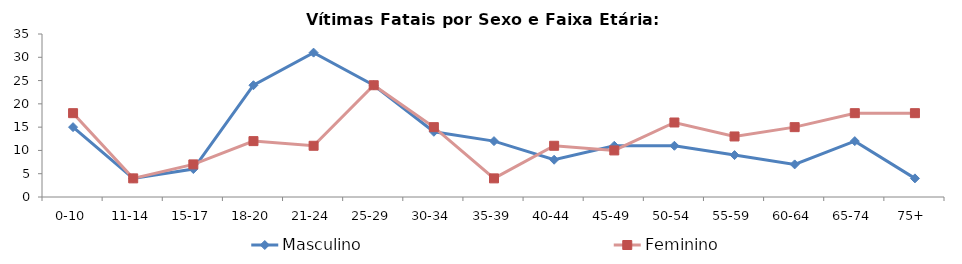
| Category | Masculino | Feminino |
|---|---|---|
| 0-10 | 15 | 18 |
| 11-14 | 4 | 4 |
| 15-17 | 6 | 7 |
| 18-20 | 24 | 12 |
| 21-24 | 31 | 11 |
| 25-29 | 24 | 24 |
| 30-34 | 14 | 15 |
| 35-39 | 12 | 4 |
| 40-44 | 8 | 11 |
| 45-49 | 11 | 10 |
| 50-54 | 11 | 16 |
| 55-59 | 9 | 13 |
| 60-64 | 7 | 15 |
| 65-74 | 12 | 18 |
| 75+ | 4 | 18 |